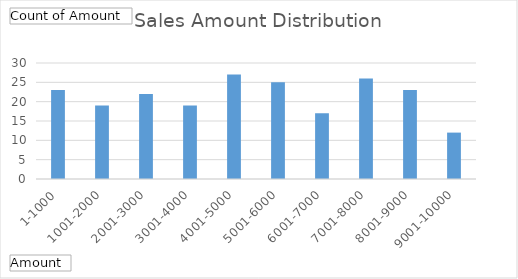
| Category | Total |
|---|---|
| 1-1000 | 23 |
| 1001-2000 | 19 |
| 2001-3000 | 22 |
| 3001-4000 | 19 |
| 4001-5000 | 27 |
| 5001-6000 | 25 |
| 6001-7000 | 17 |
| 7001-8000 | 26 |
| 8001-9000 | 23 |
| 9001-10000 | 12 |